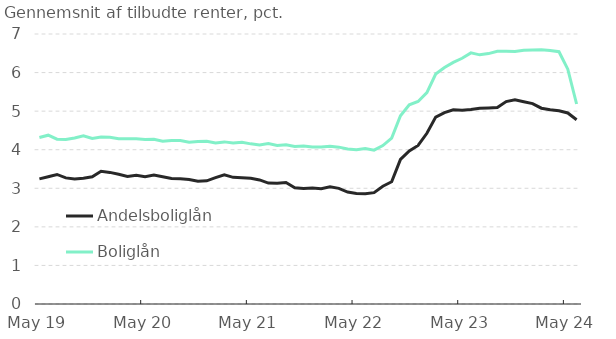
| Category | Andelsboliglån | Boliglån |
|---|---|---|
| 2019-05-01 | 3.244 | 4.318 |
| 2019-06-01 | 3.3 | 4.376 |
| 2019-07-01 | 3.358 | 4.272 |
| 2019-08-01 | 3.269 | 4.264 |
| 2019-09-01 | 3.242 | 4.304 |
| 2019-10-01 | 3.26 | 4.362 |
| 2019-11-01 | 3.298 | 4.29 |
| 2019-12-01 | 3.442 | 4.327 |
| 2020-01-01 | 3.412 | 4.321 |
| 2020-02-01 | 3.365 | 4.284 |
| 2020-03-01 | 3.307 | 4.281 |
| 2020-04-01 | 3.34 | 4.283 |
| 2020-05-01 | 3.301 | 4.265 |
| 2020-06-01 | 3.343 | 4.271 |
| 2020-07-01 | 3.298 | 4.219 |
| 2020-08-01 | 3.252 | 4.237 |
| 2020-09-01 | 3.245 | 4.241 |
| 2020-10-01 | 3.23 | 4.195 |
| 2020-11-01 | 3.184 | 4.211 |
| 2020-12-01 | 3.194 | 4.22 |
| 2021-01-01 | 3.275 | 4.177 |
| 2021-02-01 | 3.351 | 4.203 |
| 2021-03-01 | 3.284 | 4.172 |
| 2021-04-01 | 3.272 | 4.191 |
| 2021-05-01 | 3.257 | 4.152 |
| 2021-06-01 | 3.216 | 4.124 |
| 2021-07-01 | 3.134 | 4.158 |
| 2021-08-01 | 3.131 | 4.111 |
| 2021-09-01 | 3.15 | 4.131 |
| 2021-10-01 | 3.014 | 4.085 |
| 2021-11-01 | 2.992 | 4.098 |
| 2021-12-01 | 3.009 | 4.073 |
| 2022-01-01 | 2.991 | 4.068 |
| 2022-02-01 | 3.04 | 4.092 |
| 2022-03-01 | 2.999 | 4.067 |
| 2022-04-01 | 2.901 | 4.018 |
| 2022-05-01 | 2.864 | 4.001 |
| 2022-06-01 | 2.858 | 4.032 |
| 2022-07-01 | 2.886 | 3.988 |
| 2022-08-01 | 3.053 | 4.107 |
| 2022-09-01 | 3.169 | 4.301 |
| 2022-10-01 | 3.75 | 4.88 |
| 2022-11-01 | 3.97 | 5.164 |
| 2022-12-01 | 4.11 | 5.252 |
| 2023-01-01 | 4.426 | 5.479 |
| 2023-02-01 | 4.845 | 5.962 |
| 2023-03-01 | 4.96 | 6.131 |
| 2023-04-01 | 5.034 | 6.264 |
| 2023-05-01 | 5.026 | 6.371 |
| 2023-06-01 | 5.042 | 6.511 |
| 2023-07-01 | 5.078 | 6.46 |
| 2023-08-01 | 5.084 | 6.492 |
| 2023-09-01 | 5.092 | 6.553 |
| 2023-10-01 | 5.249 | 6.553 |
| 2023-11-01 | 5.292 | 6.547 |
| 2023-12-01 | 5.244 | 6.58 |
| 2024-01-01 | 5.196 | 6.588 |
| 2024-02-01 | 5.077 | 6.593 |
| 2024-03-01 | 5.038 | 6.575 |
| 2024-04-01 | 5.01 | 6.541 |
| 2024-05-01 | 4.953 | 6.088 |
| 2024-06-01 | 4.778 | 5.185 |